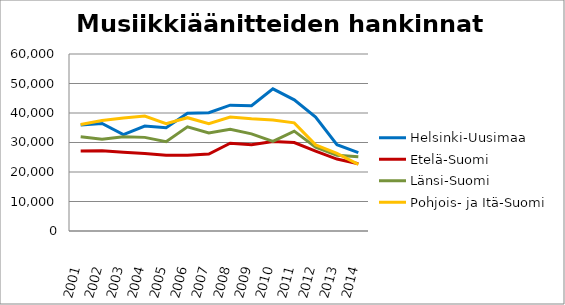
| Category | Helsinki-Uusimaa | Etelä-Suomi | Länsi-Suomi | Pohjois- ja Itä-Suomi |
|---|---|---|---|---|
| 2001.0 | 35953 | 27127 | 31932 | 36100 |
| 2002.0 | 36447 | 27213 | 31127 | 37475 |
| 2003.0 | 32699 | 26689 | 31932 | 38324 |
| 2004.0 | 35594 | 26238 | 31738 | 38971 |
| 2005.0 | 35042 | 25718 | 30278 | 36369 |
| 2006.0 | 39890 | 25651 | 35330 | 38413 |
| 2007.0 | 40087 | 26097 | 33200 | 36366 |
| 2008.0 | 42664 | 29738 | 34450 | 38619 |
| 2009.0 | 42473 | 29262 | 32916 | 38021 |
| 2010.0 | 48198 | 30366 | 30374 | 37610 |
| 2011.0 | 44471 | 29971 | 33841 | 36666 |
| 2012.0 | 38600 | 27097 | 28409 | 29184 |
| 2013.0 | 29264 | 24382 | 25671 | 26304 |
| 2014.0 | 26561 | 22821 | 25129 | 22564 |